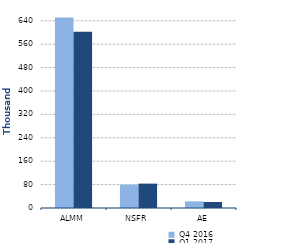
| Category | Q4 2016 | Q1 2017 |
|---|---|---|
| 0 | 650820 | 602362 |
| 1/1/00 | 79977 | 83323 |
| 1/2/00 | 22650 | 20496 |